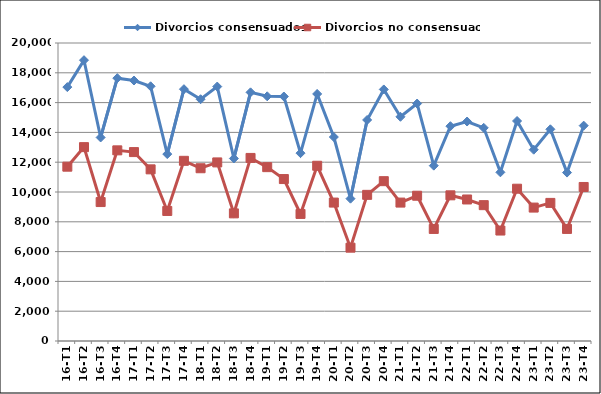
| Category | Divorcios consensuados | Divorcios no consensuados |
|---|---|---|
| 16-T1 | 17041 | 11699 |
| 16-T2 | 18847 | 13011 |
| 16-T3 | 13660 | 9325 |
| 16-T4 | 17641 | 12795 |
| 17-T1 | 17483 | 12679 |
| 17-T2 | 17095 | 11520 |
| 17-T3 | 12545 | 8727 |
| 17-T4 | 16901 | 12093 |
| 18-T1 | 16226 | 11594 |
| 18-T2 | 17077 | 11986 |
| 18-T3 | 12249 | 8566 |
| 18-T4 | 16689 | 12287 |
| 19-T1 | 16423 | 11668 |
| 19-T2 | 16409 | 10869 |
| 19-T3 | 12607 | 8528 |
| 19-T4 | 16581 | 11761 |
| 20-T1 | 13690 | 9290 |
| 20-T2 | 9552 | 6264 |
| 20-T3 | 14835 | 9809 |
| 20-T4 | 16883 | 10727 |
| 21-T1 | 15048 | 9290 |
| 21-T2 | 15937 | 9750 |
| 21-T3 | 11767 | 7520 |
| 21-T4 | 14416 | 9777 |
| 22-T1 | 14730 | 9498 |
| 22-T2 | 14306 | 9118 |
| 22-T3 | 11321 | 7413 |
| 22-T4 | 14766 | 10221 |
| 23-T1 | 12839 | 8954 |
| 23-T2 | 14208 | 9269 |
| 23-T3 | 11303 | 7522 |
| 23-T4 | 14453 | 10337 |